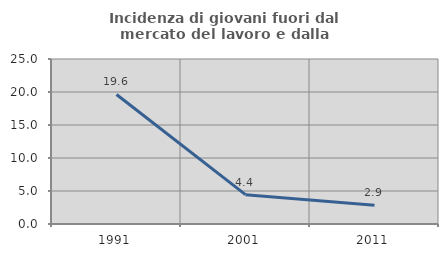
| Category | Incidenza di giovani fuori dal mercato del lavoro e dalla formazione  |
|---|---|
| 1991.0 | 19.626 |
| 2001.0 | 4.444 |
| 2011.0 | 2.857 |